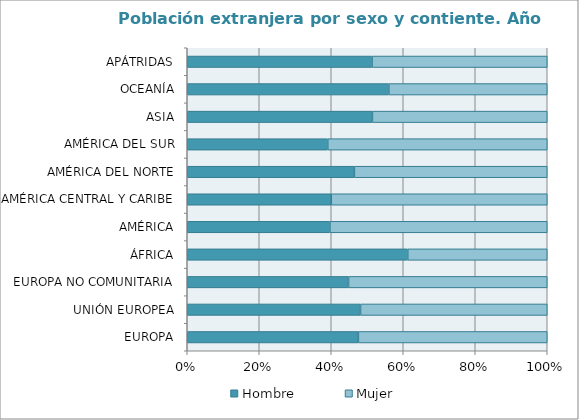
| Category | Hombre | Mujer |
|---|---|---|
| EUROPA | 7972 | 8796 |
| UNIÓN EUROPEA | 6619 | 7129 |
| EUROPA NO COMUNITARIA | 1353 | 1667 |
| ÁFRICA | 3758 | 2377 |
| AMÉRICA | 7799 | 11876 |
| AMÉRICA CENTRAL Y CARIBE | 1729 | 2593 |
| AMÉRICA DEL NORTE | 482 | 556 |
| AMÉRICA DEL SUR | 5588 | 8727 |
| ASIA | 1353 | 1277 |
| OCEANÍA | 28 | 22 |
| APÁTRIDAS | 96 | 91 |